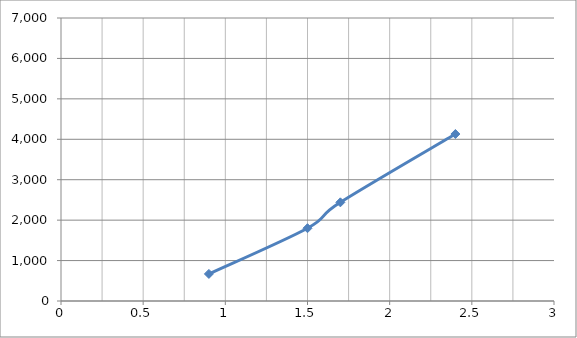
| Category | Series 0 |
|---|---|
| 0.9 | 670 |
| 1.5 | 1800 |
| 1.7 | 2440 |
| 2.4 | 4130 |